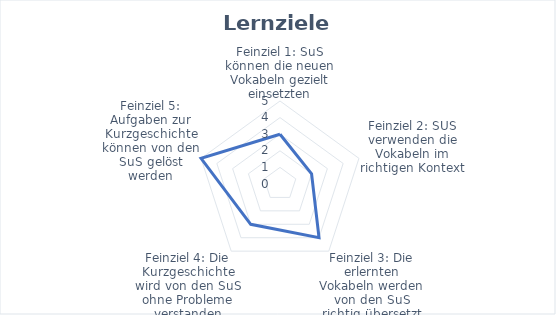
| Category | Zielerreichung  |
|---|---|
| Feinziel 1: SuS können die neuen Vokabeln gezielt einsetzten | 3 |
| Feinziel 2: SUS verwenden die Vokabeln im richtigen Kontext | 2 |
| Feinziel 3: Die erlernten Vokabeln werden von den SuS richtig übersetzt | 4 |
| Feinziel 4: Die Kurzgeschichte wird von den SuS ohne Probleme verstanden | 3 |
| Feinziel 5: Aufgaben zur Kurzgeschichte können von den SuS gelöst werden | 5 |